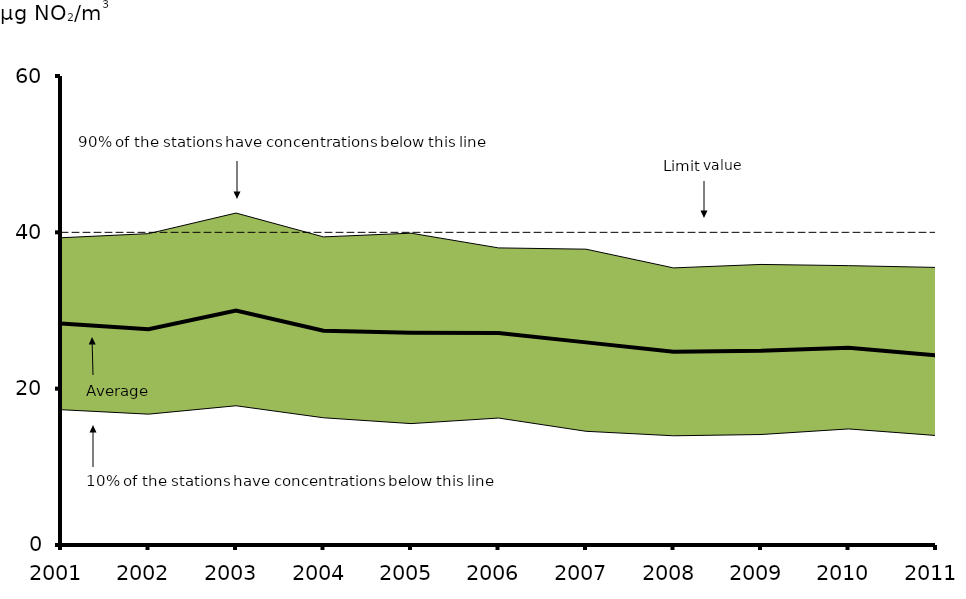
| Category | Average | Limit value |
|---|---|---|
| 0 | 28.347 | 40 |
| 1 | 27.599 | 40 |
| 2 | 29.985 | 40 |
| 3 | 27.413 | 40 |
| 4 | 27.161 | 40 |
| 5 | 27.111 | 40 |
| 6 | 25.921 | 40 |
| 7 | 24.72 | 40 |
| 8 | 24.853 | 40 |
| 9 | 25.244 | 40 |
| 10 | 24.266 | 40 |